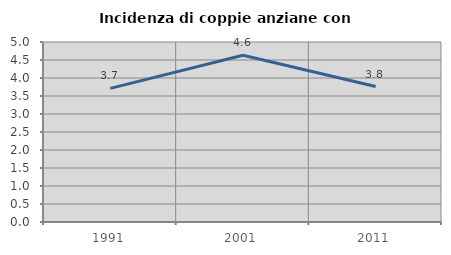
| Category | Incidenza di coppie anziane con figli |
|---|---|
| 1991.0 | 3.711 |
| 2001.0 | 4.633 |
| 2011.0 | 3.762 |